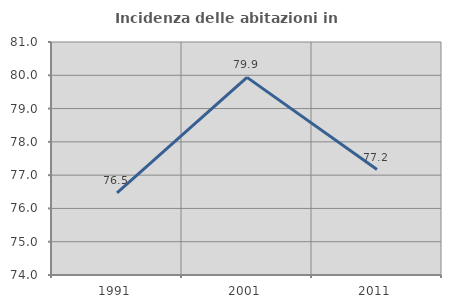
| Category | Incidenza delle abitazioni in proprietà  |
|---|---|
| 1991.0 | 76.471 |
| 2001.0 | 79.937 |
| 2011.0 | 77.168 |